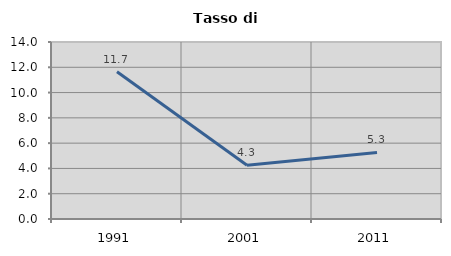
| Category | Tasso di disoccupazione   |
|---|---|
| 1991.0 | 11.653 |
| 2001.0 | 4.255 |
| 2011.0 | 5.263 |